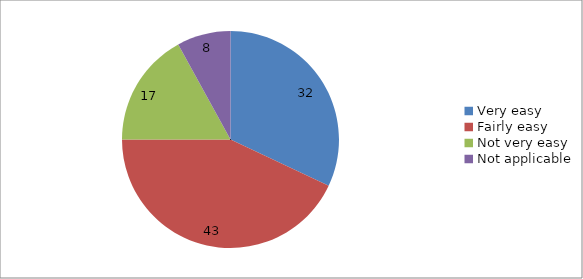
| Category | Series 0 |
|---|---|
| Very easy | 32 |
| Fairly easy | 43 |
| Not very easy | 17 |
| Not applicable | 8 |